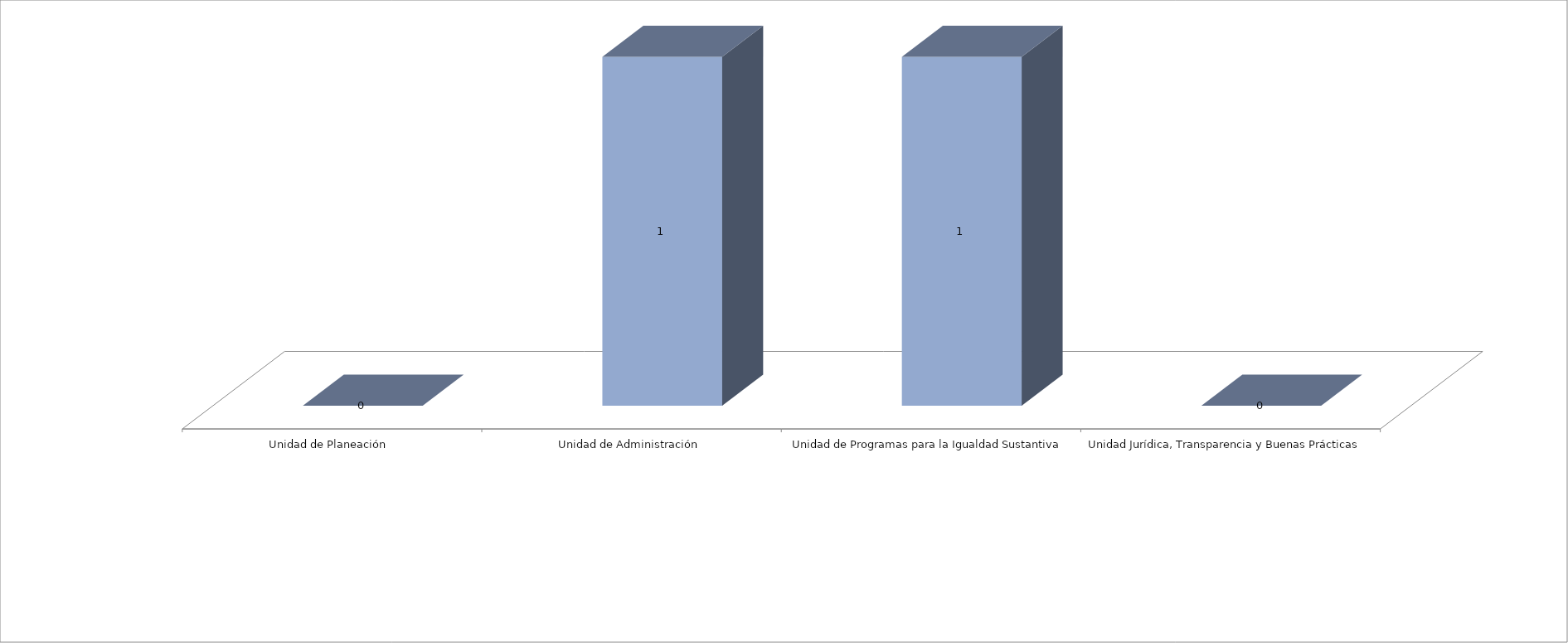
| Category | Series 0 | Series 1 |
|---|---|---|
| Unidad de Planeación  |  | 0 |
| Unidad de Administración |  | 1 |
| Unidad de Programas para la Igualdad Sustantiva |  | 1 |
| Unidad Jurídica, Transparencia y Buenas Prácticas  |  | 0 |